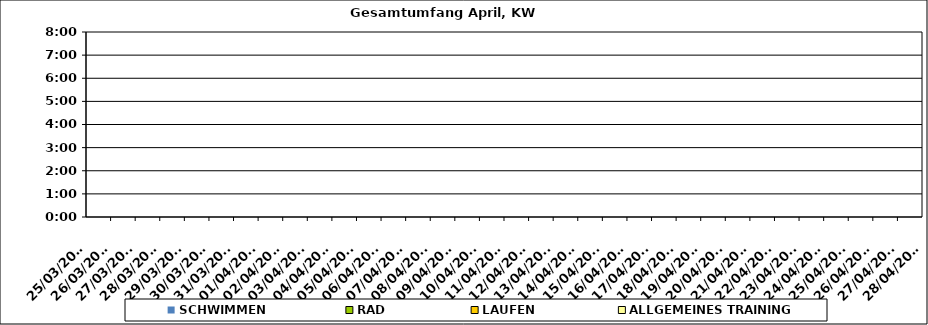
| Category | SCHWIMMEN | RAD | LAUFEN | ALLGEMEINES TRAINING |
|---|---|---|---|---|
| 27/03/2023 |  |  |  | 0 |
| 28/03/2023 |  |  |  | 0 |
| 29/03/2023 |  |  |  | 0 |
| 30/03/2023 |  |  |  | 0 |
| 31/03/2023 |  |  |  | 0 |
| 01/04/2023 |  |  |  | 0 |
| 02/04/2023 |  |  |  | 0 |
| 03/04/2023 |  |  |  | 0 |
| 04/04/2023 |  |  |  | 0 |
| 05/04/2023 |  |  |  | 0 |
| 06/04/2023 |  |  |  | 0 |
| 07/04/2023 |  |  |  | 0 |
| 08/04/2023 |  |  |  | 0 |
| 09/04/2023 |  |  |  | 0 |
| 10/04/2023 |  |  |  | 0 |
| 11/04/2023 |  |  |  | 0 |
| 12/04/2023 |  |  |  | 0 |
| 13/04/2023 |  |  |  | 0 |
| 14/04/2023 |  |  |  | 0 |
| 15/04/2023 |  |  |  | 0 |
| 16/04/2023 |  |  |  | 0 |
| 17/04/2023 |  |  |  | 0 |
| 18/04/2023 |  |  |  | 0 |
| 19/04/2023 |  |  |  | 0 |
| 20/04/2023 |  |  |  | 0 |
| 21/04/2023 |  |  |  | 0 |
| 22/04/2023 |  |  |  | 0 |
| 23/04/2023 |  |  |  | 0 |